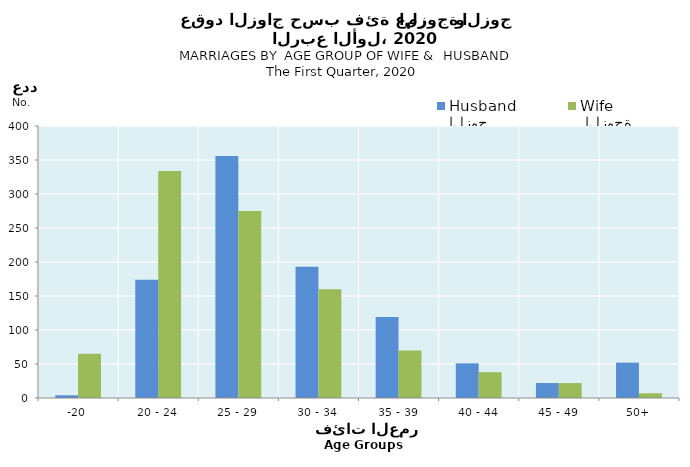
| Category | الزوج
Husband |  الزوجة
Wife |
|---|---|---|
| -20 | 4 | 65 |
| 20 - 24 | 174 | 334 |
| 25 - 29 | 356 | 275 |
| 30 - 34 | 193 | 160 |
| 35 - 39 | 119 | 70 |
| 40 - 44 | 51 | 38 |
| 45 - 49 | 22 | 22 |
| 50+ | 52 | 7 |